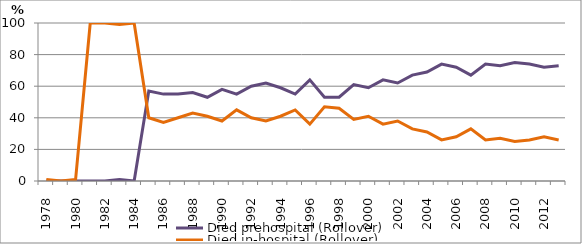
| Category | Died prehospital (Rollover) | Died in-hospital (Rollover) |
|---|---|---|
| 1978.0 | 0 | 1 |
| 1979.0 | 0 | 0 |
| 1980.0 | 0 | 1 |
| 1981.0 | 0 | 100 |
| 1982.0 | 0 | 100 |
| 1983.0 | 1 | 99 |
| 1984.0 | 0 | 100 |
| 1985.0 | 57 | 40 |
| 1986.0 | 55 | 37 |
| 1987.0 | 55 | 40 |
| 1988.0 | 56 | 43 |
| 1989.0 | 53 | 41 |
| 1990.0 | 58 | 38 |
| 1991.0 | 55 | 45 |
| 1992.0 | 60 | 40 |
| 1993.0 | 62 | 38 |
| 1994.0 | 59 | 41 |
| 1995.0 | 55 | 45 |
| 1996.0 | 64 | 36 |
| 1997.0 | 53 | 47 |
| 1998.0 | 53 | 46 |
| 1999.0 | 61 | 39 |
| 2000.0 | 59 | 41 |
| 2001.0 | 64 | 36 |
| 2002.0 | 62 | 38 |
| 2003.0 | 67 | 33 |
| 2004.0 | 69 | 31 |
| 2005.0 | 74 | 26 |
| 2006.0 | 72 | 28 |
| 2007.0 | 67 | 33 |
| 2008.0 | 74 | 26 |
| 2009.0 | 73 | 27 |
| 2010.0 | 75 | 25 |
| 2011.0 | 74 | 26 |
| 2012.0 | 72 | 28 |
| 2013.0 | 73 | 26 |